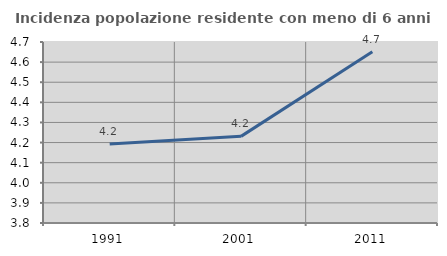
| Category | Incidenza popolazione residente con meno di 6 anni |
|---|---|
| 1991.0 | 4.193 |
| 2001.0 | 4.231 |
| 2011.0 | 4.651 |